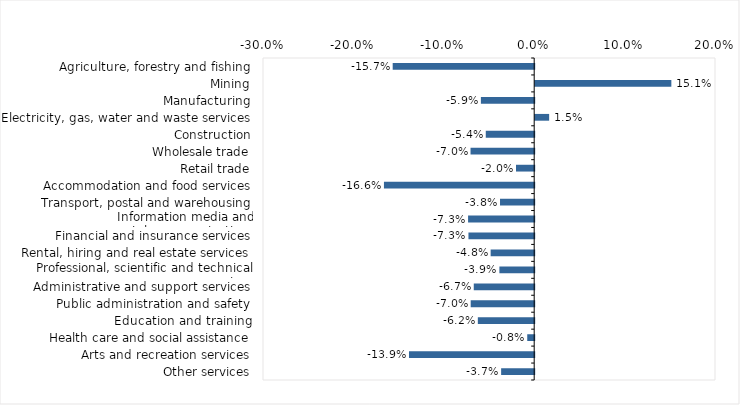
| Category | This week |
|---|---|
| Agriculture, forestry and fishing | -0.157 |
| Mining | 0.151 |
| Manufacturing | -0.059 |
| Electricity, gas, water and waste services | 0.015 |
| Construction | -0.054 |
| Wholesale trade | -0.07 |
| Retail trade | -0.02 |
| Accommodation and food services | -0.166 |
| Transport, postal and warehousing | -0.038 |
| Information media and telecommunications | -0.073 |
| Financial and insurance services | -0.073 |
| Rental, hiring and real estate services | -0.048 |
| Professional, scientific and technical services | -0.039 |
| Administrative and support services | -0.067 |
| Public administration and safety | -0.07 |
| Education and training | -0.062 |
| Health care and social assistance | -0.008 |
| Arts and recreation services | -0.139 |
| Other services | -0.037 |